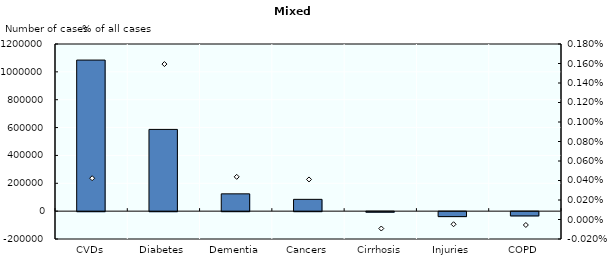
| Category | Number of cases |
|---|---|
| CVDs | 1084606.601 |
| Diabetes | 586730.481 |
| Dementia | 124240.236 |
| Cancers | 84604.868 |
| Cirrhosis | -3988.948 |
| Injuries | -35592.749 |
| COPD | -30680.361 |